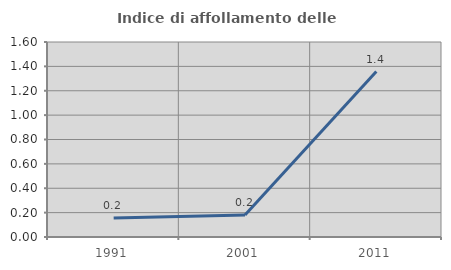
| Category | Indice di affollamento delle abitazioni  |
|---|---|
| 1991.0 | 0.156 |
| 2001.0 | 0.181 |
| 2011.0 | 1.357 |